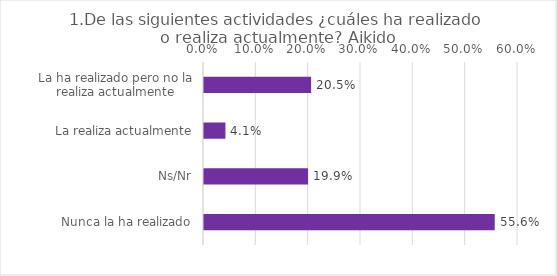
| Category | Series 0 |
|---|---|
| La ha realizado pero no la realiza actualmente | 0.205 |
| La realiza actualmente | 0.041 |
| Ns/Nr | 0.199 |
| Nunca la ha realizado | 0.556 |